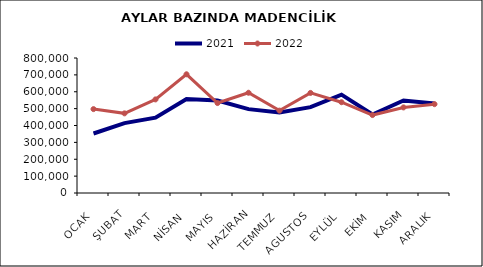
| Category | 2021 | 2022 |
|---|---|---|
| OCAK | 352707.882 | 497148.808 |
| ŞUBAT | 414333.151 | 471946.219 |
| MART | 446313.926 | 554600.511 |
| NİSAN | 557406.297 | 703513.77 |
| MAYIS | 547954.731 | 533049.23 |
| HAZİRAN | 496926.693 | 594051.504 |
| TEMMUZ | 476806.038 | 488171.183 |
| AGUSTOS | 508970.626 | 593040.366 |
| EYLÜL | 582749.425 | 537920.485 |
| EKİM | 465035.924 | 461895.51 |
| KASIM | 547964.594 | 507099.173 |
| ARALIK | 530527.502 | 526564.937 |